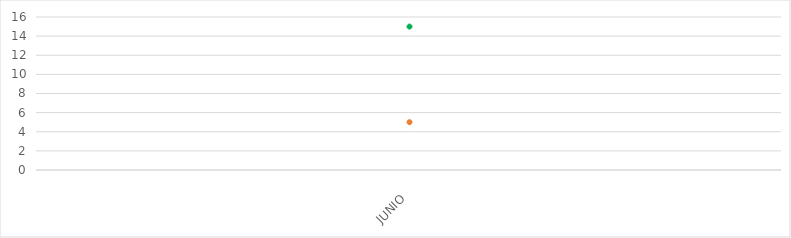
| Category | VALOR  | META PONDERADA |
|---|---|---|
| JUNIO | 15 | 5 |